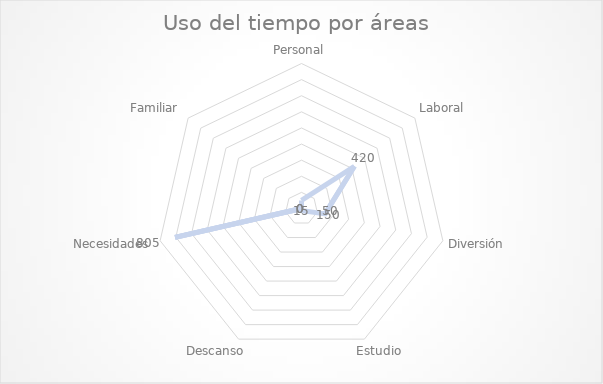
| Category | Total Tiempo (mins) |
|---|---|
| Personal | 50 |
| Laboral | 420 |
| Diversión | 150 |
| Estudio | 15 |
| Descanso | 0 |
| Necesidades | 805 |
| Familiar | 0 |